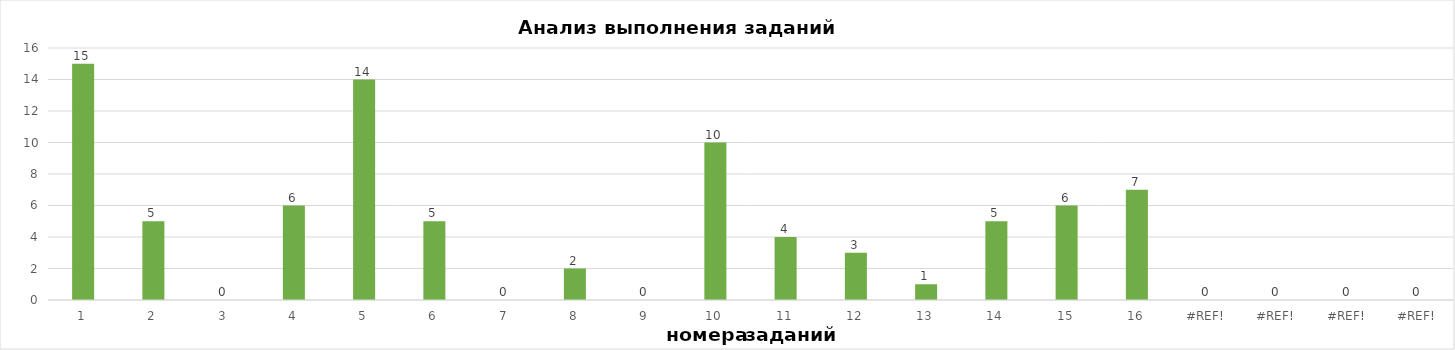
| Category | задания |
|---|---|
| 1.0 | 15 |
| 2.0 | 5 |
| 3.0 | 0 |
| 4.0 | 6 |
| 5.0 | 14 |
| 6.0 | 5 |
| 7.0 | 0 |
| 8.0 | 2 |
| 9.0 | 0 |
| 10.0 | 10 |
| 11.0 | 4 |
| 12.0 | 3 |
| 13.0 | 1 |
| 14.0 | 5 |
| 15.0 | 6 |
| 16.0 | 7 |
| 0.0 | 0 |
| 0.0 | 0 |
| 0.0 | 0 |
| 0.0 | 0 |